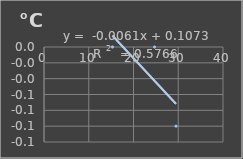
| Category | Temperatura |
|---|---|
| 15.3 | 0 |
| 24.7 | 0 |
| 29.5 | -0.1 |